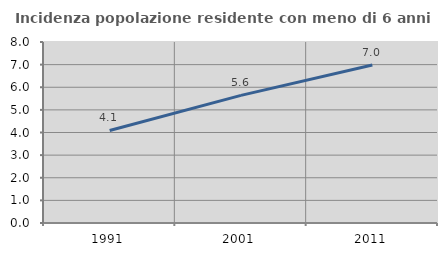
| Category | Incidenza popolazione residente con meno di 6 anni |
|---|---|
| 1991.0 | 4.09 |
| 2001.0 | 5.642 |
| 2011.0 | 6.984 |